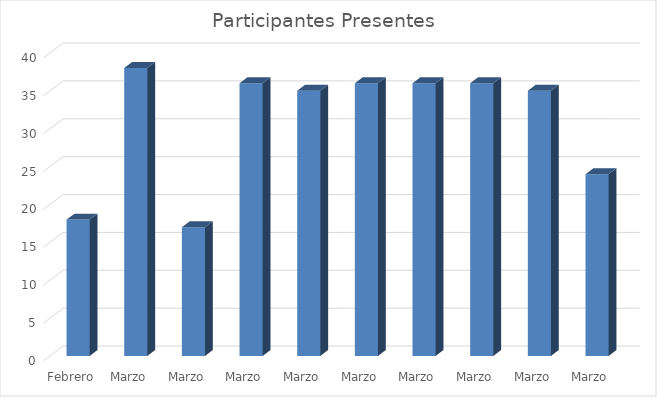
| Category | Participantes Presentes  |
|---|---|
| Febrero | 18 |
| Marzo | 38 |
| Marzo | 17 |
| Marzo | 36 |
| Marzo | 35 |
| Marzo | 36 |
| Marzo | 36 |
| Marzo | 36 |
| Marzo | 35 |
| Marzo | 24 |